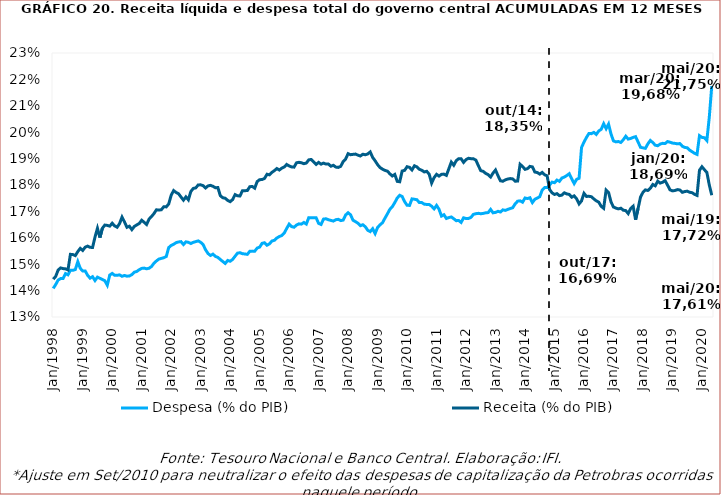
| Category | Despesa (% do PIB) | Receita (% do PIB) |
|---|---|---|
| 1998-01-01 | 0.141 | 0.144 |
| 1998-02-01 | 0.142 | 0.145 |
| 1998-03-01 | 0.144 | 0.148 |
| 1998-04-01 | 0.145 | 0.149 |
| 1998-05-01 | 0.145 | 0.148 |
| 1998-06-01 | 0.146 | 0.148 |
| 1998-07-01 | 0.146 | 0.148 |
| 1998-08-01 | 0.148 | 0.154 |
| 1998-09-01 | 0.148 | 0.154 |
| 1998-10-01 | 0.148 | 0.153 |
| 1998-11-01 | 0.151 | 0.155 |
| 1998-12-01 | 0.148 | 0.156 |
| 1999-01-01 | 0.147 | 0.155 |
| 1999-02-01 | 0.147 | 0.156 |
| 1999-03-01 | 0.146 | 0.157 |
| 1999-04-01 | 0.145 | 0.156 |
| 1999-05-01 | 0.145 | 0.156 |
| 1999-06-01 | 0.144 | 0.16 |
| 1999-07-01 | 0.145 | 0.164 |
| 1999-08-01 | 0.145 | 0.16 |
| 1999-09-01 | 0.144 | 0.164 |
| 1999-10-01 | 0.144 | 0.165 |
| 1999-11-01 | 0.142 | 0.165 |
| 1999-12-01 | 0.146 | 0.164 |
| 2000-01-01 | 0.147 | 0.166 |
| 2000-02-01 | 0.146 | 0.165 |
| 2000-03-01 | 0.146 | 0.164 |
| 2000-04-01 | 0.146 | 0.165 |
| 2000-05-01 | 0.145 | 0.168 |
| 2000-06-01 | 0.146 | 0.166 |
| 2000-07-01 | 0.145 | 0.164 |
| 2000-08-01 | 0.146 | 0.164 |
| 2000-09-01 | 0.146 | 0.163 |
| 2000-10-01 | 0.147 | 0.164 |
| 2000-11-01 | 0.147 | 0.165 |
| 2000-12-01 | 0.148 | 0.165 |
| 2001-01-01 | 0.148 | 0.167 |
| 2001-02-01 | 0.149 | 0.166 |
| 2001-03-01 | 0.148 | 0.165 |
| 2001-04-01 | 0.148 | 0.167 |
| 2001-05-01 | 0.149 | 0.168 |
| 2001-06-01 | 0.15 | 0.169 |
| 2001-07-01 | 0.151 | 0.171 |
| 2001-08-01 | 0.152 | 0.17 |
| 2001-09-01 | 0.152 | 0.171 |
| 2001-10-01 | 0.152 | 0.172 |
| 2001-11-01 | 0.153 | 0.172 |
| 2001-12-01 | 0.156 | 0.173 |
| 2002-01-01 | 0.157 | 0.176 |
| 2002-02-01 | 0.158 | 0.178 |
| 2002-03-01 | 0.158 | 0.177 |
| 2002-04-01 | 0.158 | 0.177 |
| 2002-05-01 | 0.159 | 0.175 |
| 2002-06-01 | 0.157 | 0.174 |
| 2002-07-01 | 0.158 | 0.176 |
| 2002-08-01 | 0.158 | 0.174 |
| 2002-09-01 | 0.158 | 0.178 |
| 2002-10-01 | 0.158 | 0.179 |
| 2002-11-01 | 0.159 | 0.179 |
| 2002-12-01 | 0.159 | 0.18 |
| 2003-01-01 | 0.158 | 0.18 |
| 2003-02-01 | 0.157 | 0.18 |
| 2003-03-01 | 0.155 | 0.179 |
| 2003-04-01 | 0.154 | 0.18 |
| 2003-05-01 | 0.153 | 0.18 |
| 2003-06-01 | 0.154 | 0.18 |
| 2003-07-01 | 0.153 | 0.179 |
| 2003-08-01 | 0.153 | 0.179 |
| 2003-09-01 | 0.152 | 0.176 |
| 2003-10-01 | 0.151 | 0.175 |
| 2003-11-01 | 0.15 | 0.175 |
| 2003-12-01 | 0.151 | 0.174 |
| 2004-01-01 | 0.151 | 0.174 |
| 2004-02-01 | 0.152 | 0.174 |
| 2004-03-01 | 0.153 | 0.176 |
| 2004-04-01 | 0.154 | 0.176 |
| 2004-05-01 | 0.154 | 0.176 |
| 2004-06-01 | 0.154 | 0.178 |
| 2004-07-01 | 0.154 | 0.178 |
| 2004-08-01 | 0.154 | 0.178 |
| 2004-09-01 | 0.155 | 0.179 |
| 2004-10-01 | 0.155 | 0.179 |
| 2004-11-01 | 0.155 | 0.179 |
| 2004-12-01 | 0.156 | 0.181 |
| 2005-01-01 | 0.156 | 0.182 |
| 2005-02-01 | 0.158 | 0.182 |
| 2005-03-01 | 0.158 | 0.183 |
| 2005-04-01 | 0.157 | 0.184 |
| 2005-05-01 | 0.158 | 0.184 |
| 2005-06-01 | 0.159 | 0.185 |
| 2005-07-01 | 0.159 | 0.185 |
| 2005-08-01 | 0.16 | 0.186 |
| 2005-09-01 | 0.16 | 0.186 |
| 2005-10-01 | 0.161 | 0.186 |
| 2005-11-01 | 0.162 | 0.187 |
| 2005-12-01 | 0.164 | 0.188 |
| 2006-01-01 | 0.165 | 0.187 |
| 2006-02-01 | 0.164 | 0.187 |
| 2006-03-01 | 0.164 | 0.187 |
| 2006-04-01 | 0.165 | 0.188 |
| 2006-05-01 | 0.165 | 0.189 |
| 2006-06-01 | 0.165 | 0.188 |
| 2006-07-01 | 0.166 | 0.188 |
| 2006-08-01 | 0.165 | 0.188 |
| 2006-09-01 | 0.168 | 0.19 |
| 2006-10-01 | 0.168 | 0.19 |
| 2006-11-01 | 0.168 | 0.189 |
| 2006-12-01 | 0.168 | 0.188 |
| 2007-01-01 | 0.165 | 0.189 |
| 2007-02-01 | 0.165 | 0.188 |
| 2007-03-01 | 0.167 | 0.188 |
| 2007-04-01 | 0.167 | 0.188 |
| 2007-05-01 | 0.167 | 0.188 |
| 2007-06-01 | 0.167 | 0.187 |
| 2007-07-01 | 0.166 | 0.187 |
| 2007-08-01 | 0.167 | 0.187 |
| 2007-09-01 | 0.167 | 0.187 |
| 2007-10-01 | 0.167 | 0.187 |
| 2007-11-01 | 0.167 | 0.189 |
| 2007-12-01 | 0.169 | 0.19 |
| 2008-01-01 | 0.169 | 0.192 |
| 2008-02-01 | 0.169 | 0.191 |
| 2008-03-01 | 0.167 | 0.192 |
| 2008-04-01 | 0.166 | 0.192 |
| 2008-05-01 | 0.166 | 0.191 |
| 2008-06-01 | 0.165 | 0.191 |
| 2008-07-01 | 0.165 | 0.192 |
| 2008-08-01 | 0.164 | 0.191 |
| 2008-09-01 | 0.163 | 0.192 |
| 2008-10-01 | 0.162 | 0.193 |
| 2008-11-01 | 0.163 | 0.19 |
| 2008-12-01 | 0.162 | 0.189 |
| 2009-01-01 | 0.164 | 0.188 |
| 2009-02-01 | 0.165 | 0.187 |
| 2009-03-01 | 0.166 | 0.186 |
| 2009-04-01 | 0.167 | 0.186 |
| 2009-05-01 | 0.169 | 0.185 |
| 2009-06-01 | 0.171 | 0.184 |
| 2009-07-01 | 0.172 | 0.183 |
| 2009-08-01 | 0.173 | 0.184 |
| 2009-09-01 | 0.175 | 0.181 |
| 2009-10-01 | 0.176 | 0.181 |
| 2009-11-01 | 0.176 | 0.185 |
| 2009-12-01 | 0.174 | 0.186 |
| 2010-01-01 | 0.172 | 0.187 |
| 2010-02-01 | 0.172 | 0.187 |
| 2010-03-01 | 0.175 | 0.186 |
| 2010-04-01 | 0.175 | 0.187 |
| 2010-05-01 | 0.174 | 0.187 |
| 2010-06-01 | 0.173 | 0.186 |
| 2010-07-01 | 0.173 | 0.186 |
| 2010-08-01 | 0.173 | 0.185 |
| 2010-09-01 | 0.173 | 0.185 |
| 2010-10-01 | 0.173 | 0.184 |
| 2010-11-01 | 0.172 | 0.181 |
| 2010-12-01 | 0.171 | 0.183 |
| 2011-01-01 | 0.172 | 0.184 |
| 2011-02-01 | 0.171 | 0.183 |
| 2011-03-01 | 0.168 | 0.184 |
| 2011-04-01 | 0.169 | 0.184 |
| 2011-05-01 | 0.167 | 0.184 |
| 2011-06-01 | 0.168 | 0.186 |
| 2011-07-01 | 0.168 | 0.189 |
| 2011-08-01 | 0.167 | 0.187 |
| 2011-09-01 | 0.166 | 0.189 |
| 2011-10-01 | 0.167 | 0.19 |
| 2011-11-01 | 0.166 | 0.19 |
| 2011-12-01 | 0.168 | 0.189 |
| 2012-01-01 | 0.167 | 0.19 |
| 2012-02-01 | 0.167 | 0.19 |
| 2012-03-01 | 0.168 | 0.19 |
| 2012-04-01 | 0.169 | 0.19 |
| 2012-05-01 | 0.169 | 0.189 |
| 2012-06-01 | 0.169 | 0.187 |
| 2012-07-01 | 0.169 | 0.185 |
| 2012-08-01 | 0.169 | 0.185 |
| 2012-09-01 | 0.169 | 0.184 |
| 2012-10-01 | 0.17 | 0.184 |
| 2012-11-01 | 0.171 | 0.183 |
| 2012-12-01 | 0.169 | 0.185 |
| 2013-01-01 | 0.17 | 0.186 |
| 2013-02-01 | 0.17 | 0.184 |
| 2013-03-01 | 0.17 | 0.182 |
| 2013-04-01 | 0.171 | 0.181 |
| 2013-05-01 | 0.17 | 0.182 |
| 2013-06-01 | 0.171 | 0.182 |
| 2013-07-01 | 0.171 | 0.182 |
| 2013-08-01 | 0.171 | 0.182 |
| 2013-09-01 | 0.173 | 0.181 |
| 2013-10-01 | 0.174 | 0.181 |
| 2013-11-01 | 0.174 | 0.188 |
| 2013-12-01 | 0.173 | 0.187 |
| 2014-01-01 | 0.175 | 0.186 |
| 2014-02-01 | 0.175 | 0.186 |
| 2014-03-01 | 0.175 | 0.187 |
| 2014-04-01 | 0.173 | 0.187 |
| 2014-05-01 | 0.175 | 0.185 |
| 2014-06-01 | 0.175 | 0.185 |
| 2014-07-01 | 0.176 | 0.184 |
| 2014-08-01 | 0.178 | 0.185 |
| 2014-09-01 | 0.179 | 0.184 |
| 2014-10-01 | 0.179 | 0.183 |
| 2014-11-01 | 0.18 | 0.178 |
| 2014-12-01 | 0.181 | 0.177 |
| 2015-01-01 | 0.181 | 0.176 |
| 2015-02-01 | 0.182 | 0.177 |
| 2015-03-01 | 0.181 | 0.176 |
| 2015-04-01 | 0.183 | 0.176 |
| 2015-05-01 | 0.183 | 0.177 |
| 2015-06-01 | 0.184 | 0.177 |
| 2015-07-01 | 0.184 | 0.176 |
| 2015-08-01 | 0.182 | 0.175 |
| 2015-09-01 | 0.181 | 0.176 |
| 2015-10-01 | 0.182 | 0.175 |
| 2015-11-01 | 0.183 | 0.173 |
| 2015-12-01 | 0.194 | 0.174 |
| 2016-01-01 | 0.196 | 0.177 |
| 2016-02-01 | 0.198 | 0.176 |
| 2016-03-01 | 0.199 | 0.176 |
| 2016-04-01 | 0.199 | 0.176 |
| 2016-05-01 | 0.2 | 0.175 |
| 2016-06-01 | 0.199 | 0.174 |
| 2016-07-01 | 0.2 | 0.174 |
| 2016-08-01 | 0.201 | 0.172 |
| 2016-09-01 | 0.203 | 0.171 |
| 2016-10-01 | 0.201 | 0.178 |
| 2016-11-01 | 0.203 | 0.177 |
| 2016-12-01 | 0.199 | 0.174 |
| 2017-01-01 | 0.197 | 0.172 |
| 2017-02-01 | 0.196 | 0.171 |
| 2017-03-01 | 0.196 | 0.171 |
| 2017-04-01 | 0.196 | 0.171 |
| 2017-05-01 | 0.197 | 0.17 |
| 2017-06-01 | 0.198 | 0.17 |
| 2017-07-01 | 0.197 | 0.169 |
| 2017-08-01 | 0.198 | 0.171 |
| 2017-09-01 | 0.198 | 0.172 |
| 2017-10-01 | 0.198 | 0.167 |
| 2017-11-01 | 0.196 | 0.171 |
| 2017-12-01 | 0.194 | 0.175 |
| 2018-01-01 | 0.194 | 0.177 |
| 2018-02-01 | 0.194 | 0.178 |
| 2018-03-01 | 0.196 | 0.178 |
| 2018-04-01 | 0.197 | 0.179 |
| 2018-05-01 | 0.196 | 0.18 |
| 2018-06-01 | 0.195 | 0.18 |
| 2018-07-01 | 0.195 | 0.181 |
| 2018-08-01 | 0.195 | 0.181 |
| 2018-09-01 | 0.196 | 0.181 |
| 2018-10-01 | 0.196 | 0.182 |
| 2018-11-01 | 0.196 | 0.18 |
| 2018-12-01 | 0.196 | 0.178 |
| 2019-01-01 | 0.196 | 0.178 |
| 2019-02-01 | 0.196 | 0.178 |
| 2019-03-01 | 0.196 | 0.178 |
| 2019-04-01 | 0.196 | 0.178 |
| 2019-05-01 | 0.195 | 0.177 |
| 2019-06-01 | 0.194 | 0.178 |
| 2019-07-01 | 0.194 | 0.178 |
| 2019-08-01 | 0.193 | 0.177 |
| 2019-09-01 | 0.193 | 0.177 |
| 2019-10-01 | 0.192 | 0.176 |
| 2019-11-01 | 0.192 | 0.176 |
| 2019-12-01 | 0.199 | 0.186 |
| 2020-01-01 | 0.198 | 0.187 |
| 2020-02-01 | 0.198 | 0.186 |
| 2020-03-01 | 0.197 | 0.185 |
| 2020-04-01 | 0.206 | 0.18 |
| 2020-05-01 | 0.218 | 0.176 |